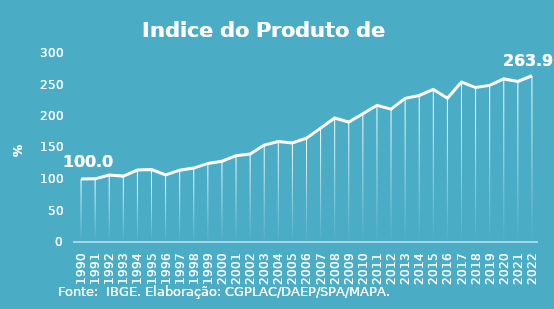
| Category | Indice de Prod. base 1990 |
|---|---|
| 1990.0 | 100 |
| 1991.0 | 100.275 |
| 1992.0 | 106.203 |
| 1993.0 | 104.57 |
| 1994.0 | 114.164 |
| 1995.0 | 115.024 |
| 1996.0 | 106.552 |
| 1997.0 | 114.037 |
| 1998.0 | 117.319 |
| 1999.0 | 124.734 |
| 2000.0 | 128.293 |
| 2001.0 | 136.975 |
| 2002.0 | 139.51 |
| 2003.0 | 153.868 |
| 2004.0 | 159.641 |
| 2005.0 | 157.136 |
| 2006.0 | 164.858 |
| 2007.0 | 180.781 |
| 2008.0 | 196.91 |
| 2009.0 | 190.309 |
| 2010.0 | 203.581 |
| 2011.0 | 217.041 |
| 2012.0 | 210.932 |
| 2013.0 | 228.009 |
| 2014.0 | 232.562 |
| 2015.0 | 242.318 |
| 2016.0 | 228.239 |
| 2017.0 | 253.826 |
| 2018.0 | 245.134 |
| 2019.0 | 248.619 |
| 2020.0 | 258.848 |
| 2021.0 | 254.988 |
| 2022.0 | 263.89 |